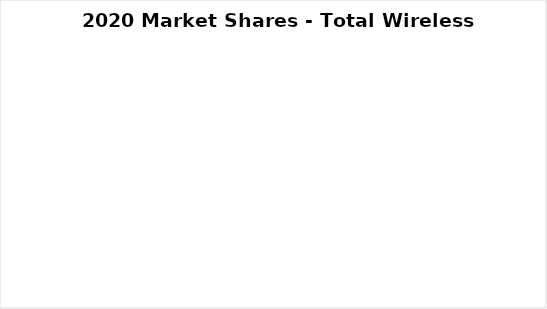
| Category | Series 0 |
|---|---|
| Cisco | 0 |
| Ericsson | 0 |
| Fujitsu | 0 |
| Huawei | 0 |
| Mavenir | 0 |
| NEC | 0 |
| Nokia | 0 |
| Samsung | 0 |
| ZTE | 0 |
| Other | 0 |